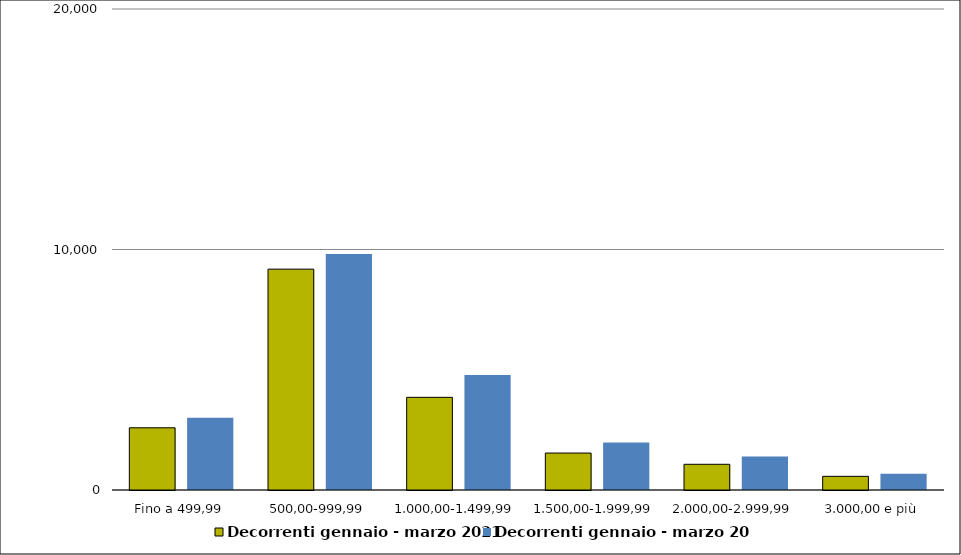
| Category | Decorrenti gennaio - marzo 2021 | Decorrenti gennaio - marzo 2020 |
|---|---|---|
|  Fino a 499,99  | 2587 | 3004 |
|  500,00-999,99  | 9183 | 9812 |
|  1.000,00-1.499,99  | 3853 | 4781 |
|  1.500,00-1.999,99  | 1536 | 1980 |
|  2.000,00-2.999,99  | 1069 | 1388 |
|  3.000,00 e più  | 568 | 677 |